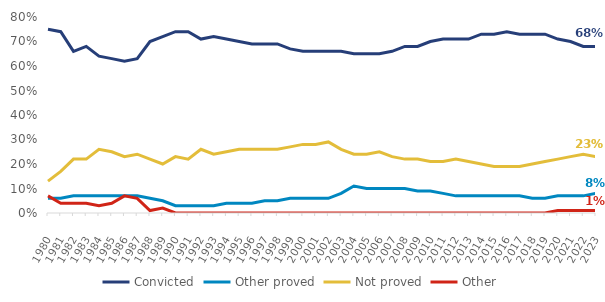
| Category | Convicted | Other proved | Not proved | Other |
|---|---|---|---|---|
| 1980.0 | 0.75 | 0.06 | 0.13 | 0.07 |
| 1981.0 | 0.74 | 0.06 | 0.17 | 0.04 |
| 1982.0 | 0.66 | 0.07 | 0.22 | 0.04 |
| 1983.0 | 0.68 | 0.07 | 0.22 | 0.04 |
| 1984.0 | 0.64 | 0.07 | 0.26 | 0.03 |
| 1985.0 | 0.63 | 0.07 | 0.25 | 0.04 |
| 1986.0 | 0.62 | 0.07 | 0.23 | 0.07 |
| 1987.0 | 0.63 | 0.07 | 0.24 | 0.06 |
| 1988.0 | 0.7 | 0.06 | 0.22 | 0.01 |
| 1989.0 | 0.72 | 0.05 | 0.2 | 0.02 |
| 1990.0 | 0.74 | 0.03 | 0.23 | 0 |
| 1991.0 | 0.74 | 0.03 | 0.22 | 0 |
| 1992.0 | 0.71 | 0.03 | 0.26 | 0 |
| 1993.0 | 0.72 | 0.03 | 0.24 | 0 |
| 1994.0 | 0.71 | 0.04 | 0.25 | 0 |
| 1995.0 | 0.7 | 0.04 | 0.26 | 0 |
| 1996.0 | 0.69 | 0.04 | 0.26 | 0 |
| 1997.0 | 0.69 | 0.05 | 0.26 | 0 |
| 1998.0 | 0.69 | 0.05 | 0.26 | 0 |
| 1999.0 | 0.67 | 0.06 | 0.27 | 0 |
| 2000.0 | 0.66 | 0.06 | 0.28 | 0 |
| 2001.0 | 0.66 | 0.06 | 0.28 | 0 |
| 2002.0 | 0.66 | 0.06 | 0.29 | 0 |
| 2003.0 | 0.66 | 0.08 | 0.26 | 0 |
| 2004.0 | 0.65 | 0.11 | 0.24 | 0 |
| 2005.0 | 0.65 | 0.1 | 0.24 | 0 |
| 2006.0 | 0.65 | 0.1 | 0.25 | 0 |
| 2007.0 | 0.66 | 0.1 | 0.23 | 0 |
| 2008.0 | 0.68 | 0.1 | 0.22 | 0 |
| 2009.0 | 0.68 | 0.09 | 0.22 | 0 |
| 2010.0 | 0.7 | 0.09 | 0.21 | 0 |
| 2011.0 | 0.71 | 0.08 | 0.21 | 0 |
| 2012.0 | 0.71 | 0.07 | 0.22 | 0 |
| 2013.0 | 0.71 | 0.07 | 0.21 | 0 |
| 2014.0 | 0.73 | 0.07 | 0.2 | 0 |
| 2015.0 | 0.73 | 0.07 | 0.19 | 0 |
| 2016.0 | 0.74 | 0.07 | 0.19 | 0 |
| 2017.0 | 0.73 | 0.07 | 0.19 | 0 |
| 2018.0 | 0.73 | 0.06 | 0.2 | 0 |
| 2019.0 | 0.73 | 0.06 | 0.21 | 0 |
| 2020.0 | 0.71 | 0.07 | 0.22 | 0.01 |
| 2021.0 | 0.7 | 0.07 | 0.23 | 0.01 |
| 2022.0 | 0.68 | 0.07 | 0.24 | 0.01 |
| 2023.0 | 0.68 | 0.08 | 0.23 | 0.01 |